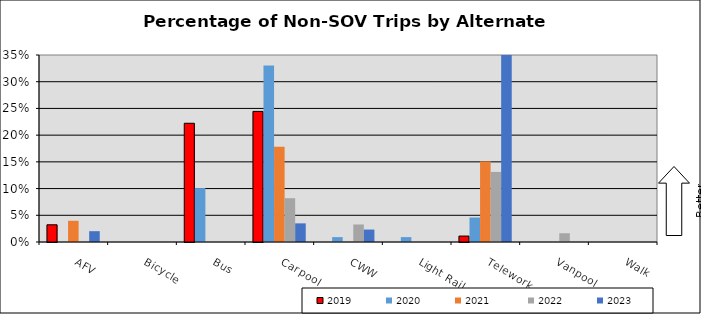
| Category | 2019 | 2020 | 2021 | 2022 | 2023 |
|---|---|---|---|---|---|
| AFV | 0.032 | 0 | 0.04 | 0 | 0.02 |
| Bicycle | 0 | 0 | 0 | 0 | 0 |
| Bus | 0.222 | 0.101 | 0 | 0 | 0 |
| Carpool | 0.244 | 0.33 | 0.178 | 0.082 | 0.035 |
| CWW | 0 | 0.009 | 0 | 0.033 | 0.023 |
| Light Rail | 0 | 0.009 | 0 | 0 | 0 |
| Telework | 0.011 | 0.046 | 0.151 | 0.131 | 0.512 |
| Vanpool | 0 | 0 | 0 | 0.016 | 0 |
| Walk | 0 | 0 | 0 | 0 | 0 |